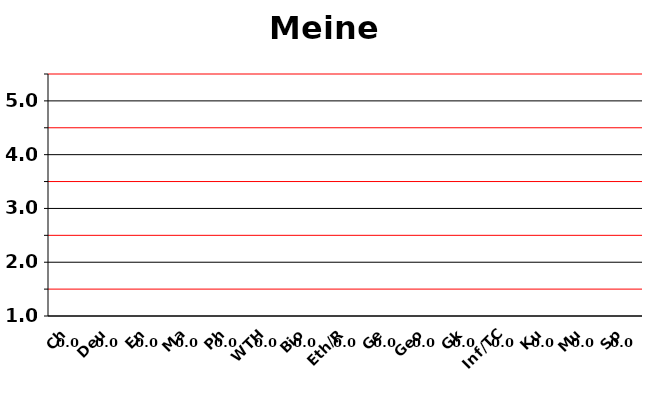
| Category | Series 0 |
|---|---|
| Ch | 0 |
| Deu | 0 |
| En | 0 |
| Ma | 0 |
| Ph | 0 |
| WTH | 0 |
| Bio | 0 |
| Eth/R | 0 |
| Ge | 0 |
| Geo | 0 |
| Gk | 0 |
| Inf/TC | 0 |
| Ku | 0 |
| Mu | 0 |
| Sp | 0 |